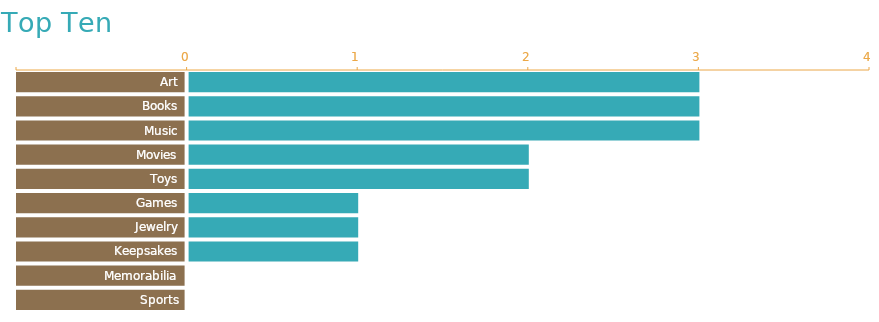
| Category | Axis | Vals |
|---|---|---|
| Art | -1 | 3 |
| Books | -1 | 3 |
| Music | -1 | 3 |
| Movies | -1 | 2 |
| Toys | -1 | 2 |
| Games | -1 | 1 |
| Jewelry | -1 | 1 |
| Keepsakes | -1 | 1 |
| Memorabilia | -1 | 0 |
| Sports | -1 | 0 |